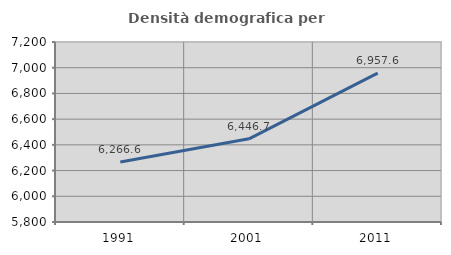
| Category | Densità demografica |
|---|---|
| 1991.0 | 6266.559 |
| 2001.0 | 6446.716 |
| 2011.0 | 6957.579 |